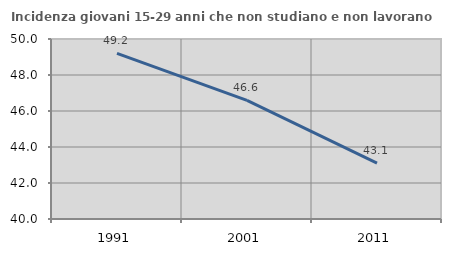
| Category | Incidenza giovani 15-29 anni che non studiano e non lavorano  |
|---|---|
| 1991.0 | 49.206 |
| 2001.0 | 46.585 |
| 2011.0 | 43.099 |